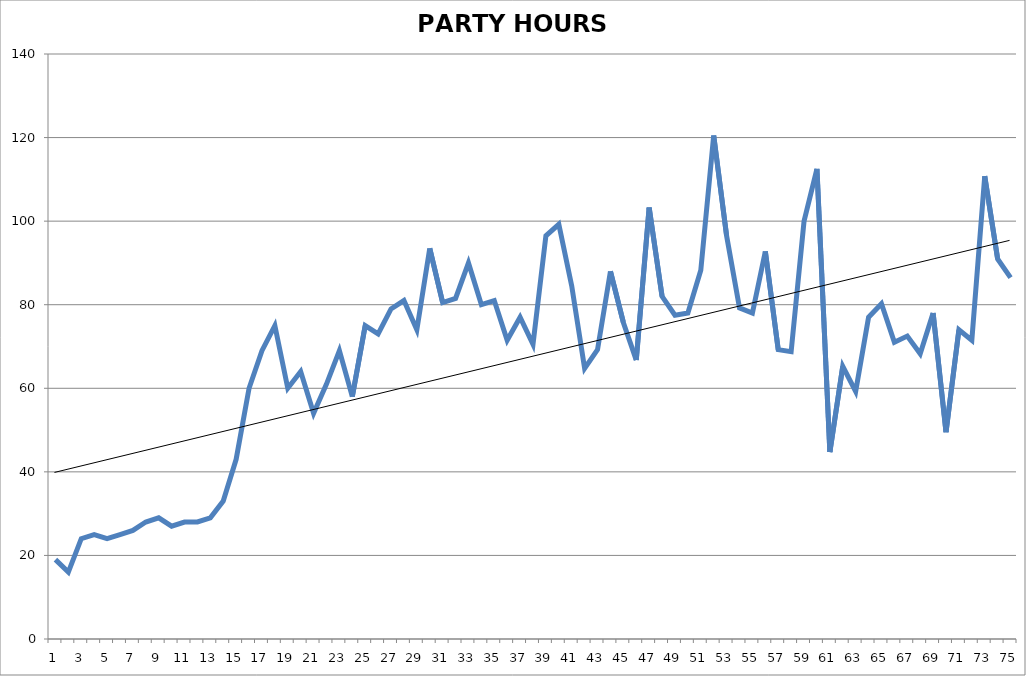
| Category | PARTY HOURS 1948-2022 |
|---|---|
| 0 | 19 |
| 1 | 16 |
| 2 | 24 |
| 3 | 25 |
| 4 | 24 |
| 5 | 25 |
| 6 | 26 |
| 7 | 28 |
| 8 | 29 |
| 9 | 27 |
| 10 | 28 |
| 11 | 28 |
| 12 | 29 |
| 13 | 33 |
| 14 | 43 |
| 15 | 60 |
| 16 | 69 |
| 17 | 75 |
| 18 | 60 |
| 19 | 64 |
| 20 | 54 |
| 21 | 61 |
| 22 | 69 |
| 23 | 58 |
| 24 | 75 |
| 25 | 73 |
| 26 | 79 |
| 27 | 81 |
| 28 | 74 |
| 29 | 93.5 |
| 30 | 80.5 |
| 31 | 81.5 |
| 32 | 90 |
| 33 | 80 |
| 34 | 81 |
| 35 | 71.5 |
| 36 | 77 |
| 37 | 70.5 |
| 38 | 96.5 |
| 39 | 99.25 |
| 40 | 84.5 |
| 41 | 64.75 |
| 42 | 69.25 |
| 43 | 88 |
| 44 | 75.75 |
| 45 | 66.75 |
| 46 | 103.25 |
| 47 | 82 |
| 48 | 77.5 |
| 49 | 78 |
| 50 | 88.25 |
| 51 | 120.5 |
| 52 | 96.5 |
| 53 | 79.25 |
| 54 | 78 |
| 55 | 92.75 |
| 56 | 69.25 |
| 57 | 68.75 |
| 58 | 100 |
| 59 | 112.5 |
| 60 | 44.75 |
| 61 | 65.25 |
| 62 | 59.25 |
| 63 | 77 |
| 64 | 80.25 |
| 65 | 71 |
| 66 | 72.5 |
| 67 | 68.25 |
| 68 | 78 |
| 69 | 49.5 |
| 70 | 74 |
| 71 | 71.5 |
| 72 | 110.75 |
| 73 | 90.95 |
| 74 | 86.5 |